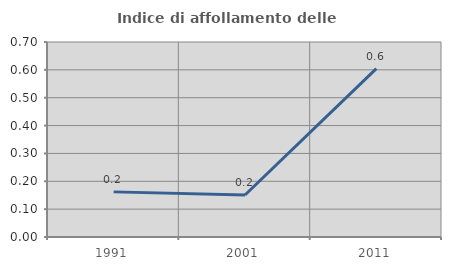
| Category | Indice di affollamento delle abitazioni  |
|---|---|
| 1991.0 | 0.162 |
| 2001.0 | 0.151 |
| 2011.0 | 0.604 |